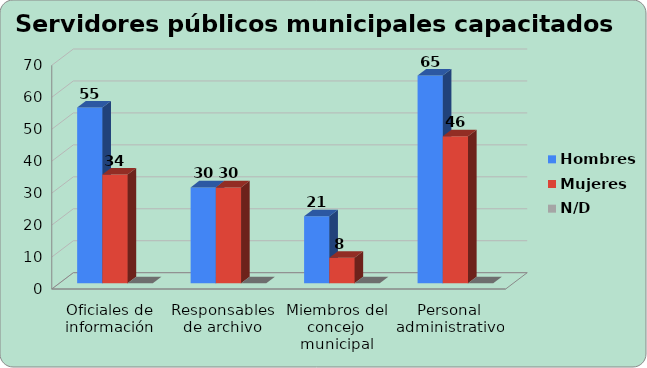
| Category | Hombres | Mujeres | N/D |
|---|---|---|---|
| Oficiales de información | 55 | 34 | 0 |
| Responsables de archivo | 30 | 30 | 0 |
| Miembros del concejo municipal | 21 | 8 | 0 |
| Personal administrativo | 65 | 46 | 0 |